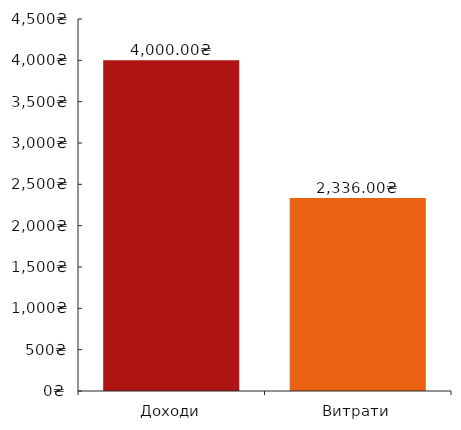
| Category | ДаніДіаграми |
|---|---|
| 0 | 4000 |
| 1 | 2336 |